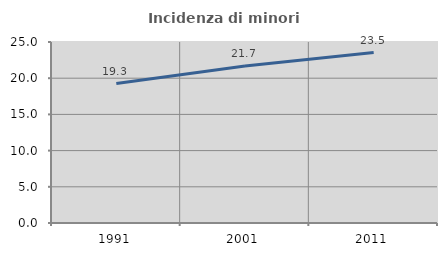
| Category | Incidenza di minori stranieri |
|---|---|
| 1991.0 | 19.266 |
| 2001.0 | 21.687 |
| 2011.0 | 23.542 |